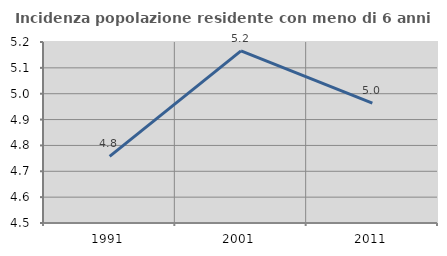
| Category | Incidenza popolazione residente con meno di 6 anni |
|---|---|
| 1991.0 | 4.758 |
| 2001.0 | 5.165 |
| 2011.0 | 4.964 |